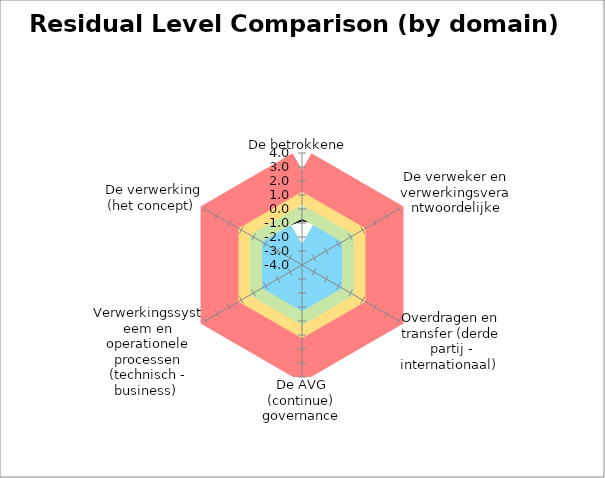
| Category | Average | Max | B | G | O | R |
|---|---|---|---|---|---|---|
| De betrokkene  | -0.8 | 2 | -2.5 | 0 | 1 | 2.8 |
| De verweker en verwerkingsverantwoordelijke | 1 | 1 | -2.5 | 0 | 1 | 2.8 |
| Overdragen en transfer (derde partij - internationaal)  | 0.333 | 1 | -2.5 | 0 | 1 | 2.8 |
| De AVG (continue) governance | 3 | 3 | -2.5 | 0 | 1 | 2.8 |
| Verwerkingssysteem en operationele processen (technisch - business)  | 1.6 | 4 | -2.5 | 0 | 1 | 2.8 |
| De verwerking (het concept)  | 0 | 1 | -2.5 | 0 | 1 | 2.8 |